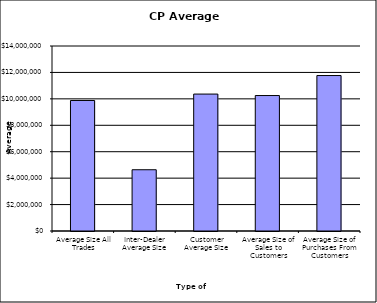
| Category | Security Type |
|---|---|
| Average Size All Trades | 9878033.261 |
| Inter-Dealer Average Size | 4635256.41 |
| Customer Average Size | 10362555.292 |
| Average Size of Sales to Customers | 10251355.499 |
| Average Size of Purchases From Customers | 11765107.527 |